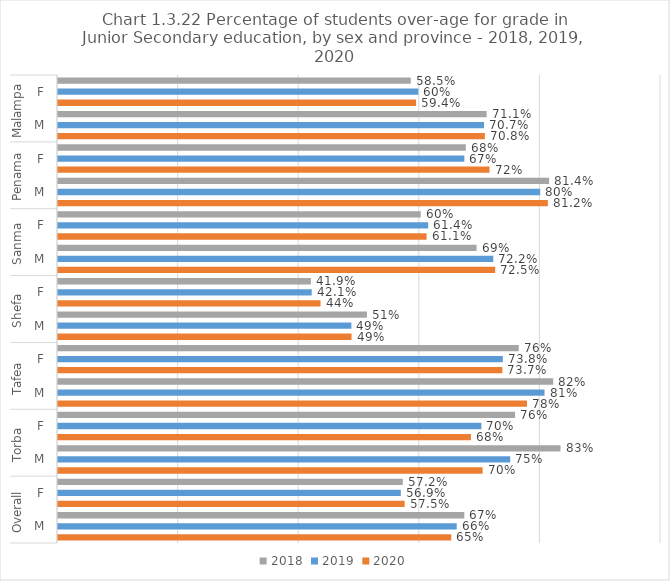
| Category | 2018 | 2019 | 2020 |
|---|---|---|---|
| 0 | 0.585 | 0.598 | 0.594 |
| 1 | 0.711 | 0.707 | 0.708 |
| 2 | 0.676 | 0.674 | 0.716 |
| 3 | 0.814 | 0.8 | 0.812 |
| 4 | 0.602 | 0.614 | 0.611 |
| 5 | 0.694 | 0.722 | 0.725 |
| 6 | 0.419 | 0.421 | 0.435 |
| 7 | 0.512 | 0.487 | 0.487 |
| 8 | 0.764 | 0.738 | 0.737 |
| 9 | 0.821 | 0.807 | 0.778 |
| 10 | 0.758 | 0.702 | 0.685 |
| 11 | 0.833 | 0.75 | 0.704 |
| 12 | 0.572 | 0.569 | 0.575 |
| 13 | 0.674 | 0.661 | 0.652 |